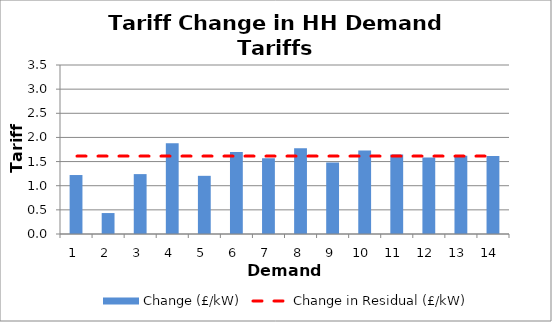
| Category | Change (£/kW) |
|---|---|
| 1.0 | 1.221 |
| 2.0 | 0.434 |
| 3.0 | 1.24 |
| 4.0 | 1.879 |
| 5.0 | 1.205 |
| 6.0 | 1.7 |
| 7.0 | 1.568 |
| 8.0 | 1.777 |
| 9.0 | 1.48 |
| 10.0 | 1.729 |
| 11.0 | 1.645 |
| 12.0 | 1.582 |
| 13.0 | 1.622 |
| 14.0 | 1.618 |